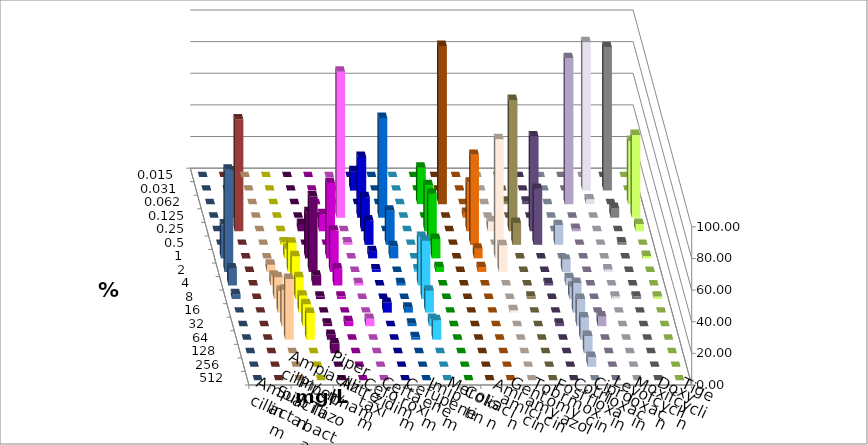
| Category | Ampicillin | Ampicillin/ Sulbactam | Piperacillin | Piperacillin/ Tazobactam | Aztreonam | Cefotaxim | Ceftazidim | Cefuroxim | Imipenem | Meropenem | Colistin | Amikacin | Gentamicin | Tobramycin | Fosfomycin | Cotrimoxazol | Ciprofloxacin | Levofloxacin | Moxifloxacin | Doxycyclin | Tigecyclin |
|---|---|---|---|---|---|---|---|---|---|---|---|---|---|---|---|---|---|---|---|---|---|
| 0.015 | 0 | 0 | 0 | 0 | 0 | 0 | 0 | 0 | 0 | 0 | 0 | 0 | 0 | 0 | 0 | 0 | 0 | 0 | 0 | 0 | 0 |
| 0.031 | 0 | 0 | 0 | 0 | 0 | 12.308 | 0 | 0 | 0 | 0 | 0 | 0 | 0 | 0 | 0 | 0 | 93.846 | 90.769 | 0 | 0 | 0 |
| 0.062 | 0 | 0 | 0 | 0 | 0 | 0 | 0 | 0 | 23.077 | 100 | 0 | 0 | 1.538 | 1.538 | 0 | 92.308 | 3.077 | 0 | 40 | 0 | 0 |
| 0.125 | 0 | 0 | 0 | 0 | 92.308 | 38.462 | 63.077 | 0 | 0 | 0 | 3.077 | 0 | 0 | 0 | 0 | 0 | 0 | 6.154 | 52.308 | 0 | 29.231 |
| 0.25 | 0 | 0 | 4.615 | 10.769 | 0 | 21.538 | 0 | 0 | 29.231 | 0 | 30.769 | 6.154 | 83.077 | 60 | 0 | 1.538 | 0 | 0 | 4.615 | 0 | 70.769 |
| 0.5 | 0 | 1.538 | 0 | 0 | 1.538 | 15.385 | 21.538 | 0 | 32.308 | 0 | 56.923 | 0 | 13.846 | 35.385 | 12.5 | 0 | 0 | 1.538 | 0 | 0 | 0 |
| 1.0 | 0 | 6.154 | 29.231 | 47.692 | 0 | 4.615 | 7.692 | 0 | 12.308 | 0 | 6.154 | 75.385 | 0 | 0 | 0 | 0 | 0 | 0 | 1.538 | 21.538 | 0 |
| 2.0 | 4.615 | 18.462 | 47.692 | 26.154 | 0 | 1.538 | 0 | 1.538 | 3.077 | 0 | 3.077 | 16.923 | 0 | 0 | 7.812 | 0 | 1.538 | 0 | 0 | 64.615 | 0 |
| 4.0 | 6.154 | 18.462 | 6.154 | 10.769 | 1.538 | 0 | 1.538 | 30.769 | 0 | 0 | 0 | 0 | 0 | 1.538 | 4.688 | 0 | 0 | 0 | 0 | 10.769 | 0 |
| 8.0 | 13.846 | 13.846 | 1.538 | 1.538 | 0 | 0 | 0 | 36.923 | 0 | 0 | 0 | 0 | 1.538 | 0 | 7.812 | 0 | 1.538 | 1.538 | 1.538 | 3.077 | 0 |
| 16.0 | 13.846 | 10.769 | 0 | 0 | 0 | 6.154 | 3.077 | 13.846 | 0 | 0 | 0 | 1.538 | 0 | 0 | 18.75 | 0 | 0 | 0 | 0 | 0 | 0 |
| 32.0 | 23.077 | 13.846 | 1.538 | 3.077 | 4.615 | 0 | 1.538 | 4.615 | 0 | 0 | 0 | 0 | 0 | 1.538 | 17.188 | 6.154 | 0 | 0 | 0 | 0 | 0 |
| 64.0 | 38.462 | 16.923 | 3.077 | 0 | 0 | 0 | 1.538 | 12.308 | 0 | 0 | 0 | 0 | 0 | 0 | 14.062 | 0 | 0 | 0 | 0 | 0 | 0 |
| 128.0 | 0 | 0 | 6.154 | 0 | 0 | 0 | 0 | 0 | 0 | 0 | 0 | 0 | 0 | 0 | 10.938 | 0 | 0 | 0 | 0 | 0 | 0 |
| 256.0 | 0 | 0 | 0 | 0 | 0 | 0 | 0 | 0 | 0 | 0 | 0 | 0 | 0 | 0 | 6.25 | 0 | 0 | 0 | 0 | 0 | 0 |
| 512.0 | 0 | 0 | 0 | 0 | 0 | 0 | 0 | 0 | 0 | 0 | 0 | 0 | 0 | 0 | 0 | 0 | 0 | 0 | 0 | 0 | 0 |